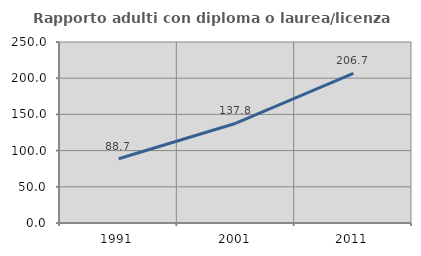
| Category | Rapporto adulti con diploma o laurea/licenza media  |
|---|---|
| 1991.0 | 88.66 |
| 2001.0 | 137.838 |
| 2011.0 | 206.667 |